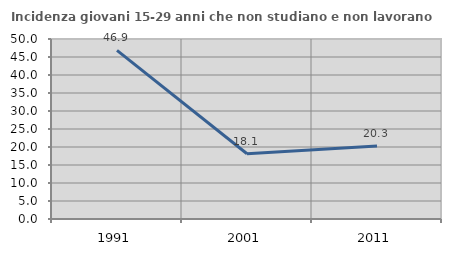
| Category | Incidenza giovani 15-29 anni che non studiano e non lavorano  |
|---|---|
| 1991.0 | 46.861 |
| 2001.0 | 18.137 |
| 2011.0 | 20.297 |